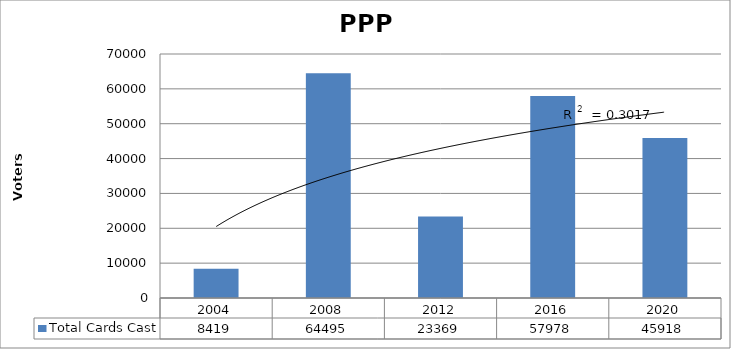
| Category | Total Cards Cast |
|---|---|
| 2004.0 | 8419 |
| 2008.0 | 64495 |
| 2012.0 | 23369 |
| 2016.0 | 57978 |
| 2020.0 | 45918 |